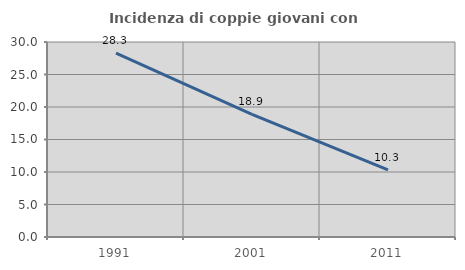
| Category | Incidenza di coppie giovani con figli |
|---|---|
| 1991.0 | 28.291 |
| 2001.0 | 18.854 |
| 2011.0 | 10.316 |